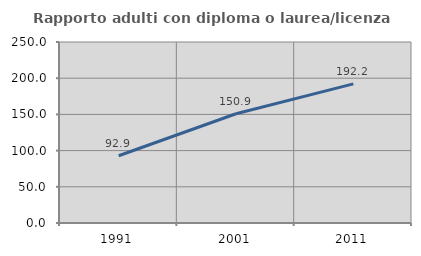
| Category | Rapporto adulti con diploma o laurea/licenza media  |
|---|---|
| 1991.0 | 92.857 |
| 2001.0 | 150.915 |
| 2011.0 | 192.194 |